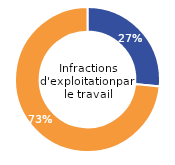
| Category | Infractions d'exploitation par le travail |
|---|---|
| Femme | 26.53 |
| Homme | 73.47 |